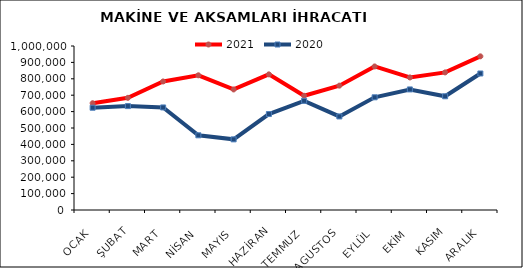
| Category | 2021 | 2020 |
|---|---|---|
| OCAK | 651051.502 | 623574.867 |
| ŞUBAT | 683887.213 | 633525.032 |
| MART | 783796.527 | 625300.006 |
| NİSAN | 821336.635 | 455416.589 |
| MAYIS | 735058.822 | 430817.028 |
| HAZİRAN | 827045.855 | 585088.293 |
| TEMMUZ | 696377.509 | 665723.418 |
| AGUSTOS | 758266.599 | 570437.735 |
| EYLÜL | 875338.965 | 687205.526 |
| EKİM | 808244.573 | 735205.985 |
| KASIM | 838973.582 | 693407.144 |
| ARALIK | 936953.856 | 832346.542 |